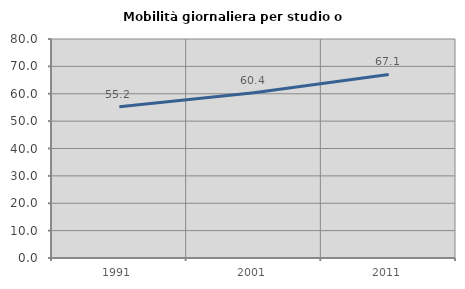
| Category | Mobilità giornaliera per studio o lavoro |
|---|---|
| 1991.0 | 55.237 |
| 2001.0 | 60.369 |
| 2011.0 | 67.061 |